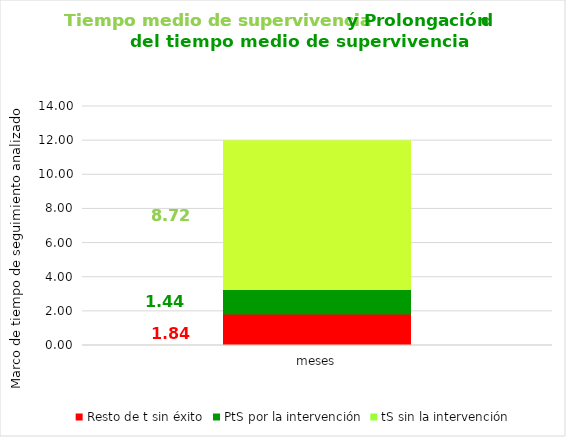
| Category | Resto de t sin éxito | PtS por la intervención | tS sin la intervención |
|---|---|---|---|
| meses | 1.841 | 1.441 | 8.718 |